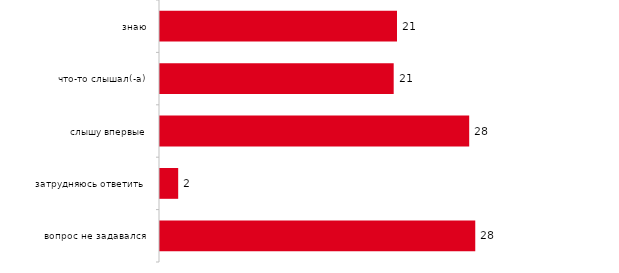
| Category | Series 0 |
|---|---|
| знаю | 21.287 |
| что-то слышал(-а) | 20.99 |
| слышу впервые | 27.772 |
| затрудняюсь ответить | 1.634 |
| вопрос не задавался | 28.317 |